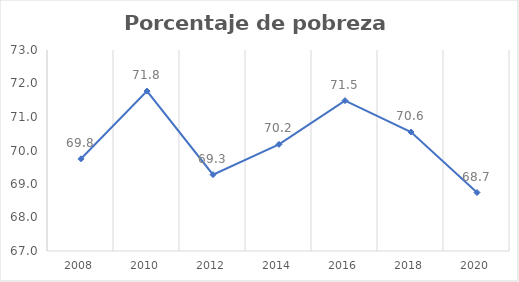
| Category | Series 0 |
|---|---|
| 2008.0 | 69.752 |
| 2010.0 | 71.775 |
| 2012.0 | 69.278 |
| 2014.0 | 70.183 |
| 2016.0 | 71.489 |
| 2018.0 | 70.553 |
| 2020.0 | 68.746 |